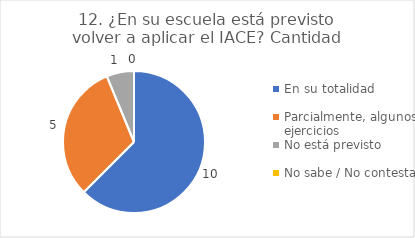
| Category | 12. ¿En su escuela está previsto volver a aplicar el IACE? |
|---|---|
| En su totalidad  | 0.625 |
| Parcialmente, algunos ejercicios  | 0.312 |
| No está previsto  | 0.062 |
| No sabe / No contesta | 0 |